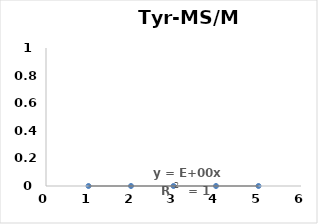
| Category | Series 0 |
|---|---|
| 0.0 | 0.89 |
| 62.5 | 4.63 |
| 125.0 | 8.62 |
| 250.0 | 16.65 |
| 500.0 | 32.74 |